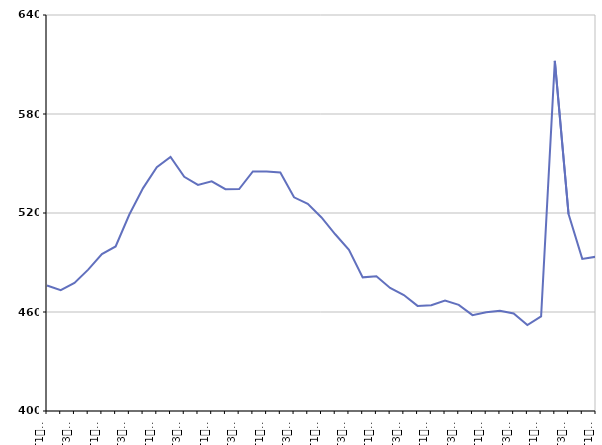
| Category | Moins de 25 ans |
|---|---|
| T1
2011 | 476.1 |
| T2
2011 | 473.2 |
| T3
2011 | 477.6 |
| T4
2011 | 485.7 |
| T1
2012 | 495.1 |
| T2
2012 | 499.7 |
| T3
2012 | 519.1 |
| T4
2012 | 535.1 |
| T1
2013 | 547.8 |
| T2
2013 | 554 |
| T3
2013 | 541.9 |
| T4
2013 | 537 |
| T1
2014 | 539.2 |
| T2
2014 | 534.4 |
| T3
2014 | 534.5 |
| T4
2014 | 545.2 |
| T1
2015 | 545.1 |
| T2
2015 | 544.6 |
| T3
2015 | 529.5 |
| T4
2015 | 525.6 |
| T1
2016 | 517.3 |
| T2
2016 | 507.1 |
| T3
2016 | 497.7 |
| T4
2016 | 481 |
| T1
2017 | 481.7 |
| T2
2017 | 474.6 |
| T3
2017 | 470.3 |
| T4
2017 | 463.7 |
| T1
2018 | 464.1 |
| T2
2018 | 466.9 |
| T3
2018 | 464.3 |
| T4
2018 | 458.1 |
| T1
2019 | 459.9 |
| T2
2019 | 460.7 |
| T3
2019 | 459.1 |
| T4
2019 | 452.1 |
| T1
2020 | 457.3 |
| T2
2020 | 612.2 |
| T3
2020 | 519.3 |
| T4
2020 | 492.2 |
| T1
2021 | 493.5 |